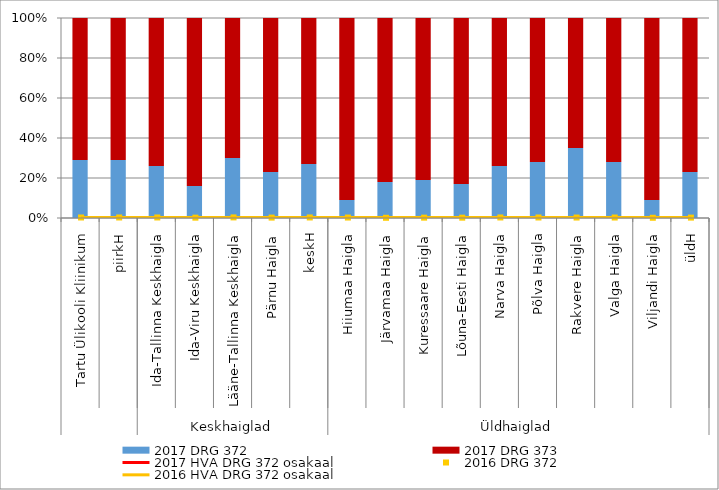
| Category | 2017 DRG 372 | 2017 DRG 373 |
|---|---|---|
| 0 | 0.29 | 0.71 |
| 1 | 0.29 | 0.71 |
| 2 | 0.26 | 0.74 |
| 3 | 0.16 | 0.84 |
| 4 | 0.3 | 0.7 |
| 5 | 0.23 | 0.77 |
| 6 | 0.27 | 0.73 |
| 7 | 0.09 | 0.91 |
| 8 | 0.18 | 0.82 |
| 9 | 0.19 | 0.81 |
| 10 | 0.17 | 0.83 |
| 11 | 0.26 | 0.74 |
| 12 | 0.28 | 0.72 |
| 13 | 0.35 | 0.65 |
| 14 | 0.28 | 0.72 |
| 15 | 0.09 | 0.91 |
| 16 | 0.23 | 0.77 |